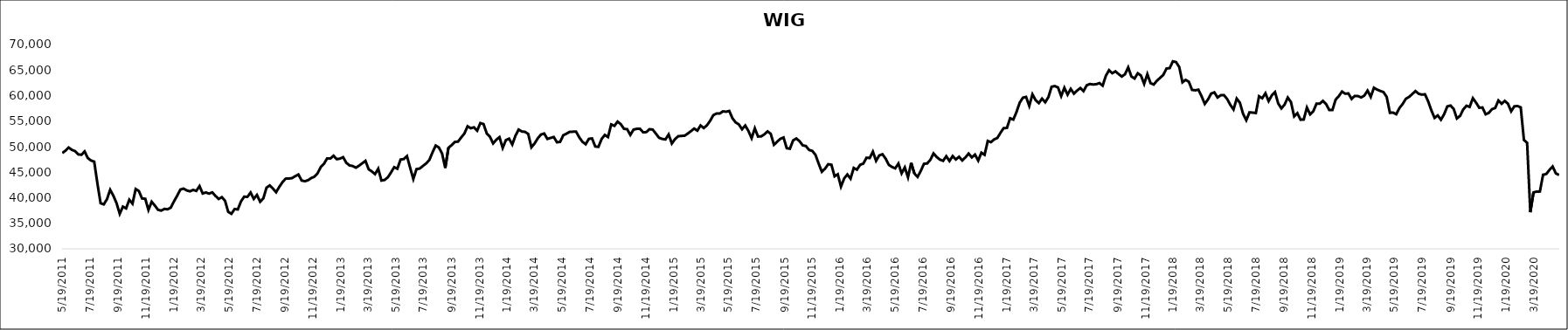
| Category | WIG |
|---|---|
| 5/19/11 | 48747.55 |
| 5/26/11 | 49215.53 |
| 6/2/11 | 49824.93 |
| 6/9/11 | 49378.82 |
| 6/16/11 | 49129.21 |
| 6/23/11 | 48485.26 |
| 6/30/11 | 48414.36 |
| 7/7/11 | 49057.05 |
| 7/14/11 | 47768.38 |
| 7/21/11 | 47291.31 |
| 7/28/11 | 47071.4 |
| 8/4/11 | 42828.22 |
| 8/11/11 | 38934.71 |
| 8/18/11 | 38697.56 |
| 8/25/11 | 39715.27 |
| 9/1/11 | 41553.09 |
| 9/8/11 | 40405.17 |
| 9/15/11 | 38945 |
| 9/22/11 | 36851.2 |
| 9/29/11 | 38264.32 |
| 10/6/11 | 37915.03 |
| 10/13/11 | 39608.13 |
| 10/20/11 | 38835.92 |
| 10/27/11 | 41708.88 |
| 11/3/11 | 41313.92 |
| 11/10/11 | 39853.18 |
| 11/17/11 | 39797.19 |
| 11/24/11 | 37607.27 |
| 12/1/11 | 39215.21 |
| 12/8/11 | 38474.28 |
| 12/15/11 | 37637.47 |
| 12/22/11 | 37478.7 |
| 12/29/11 | 37814.52 |
| 1/5/12 | 37739.39 |
| 1/12/12 | 38062.87 |
| 1/19/12 | 39288.13 |
| 1/26/12 | 40392.48 |
| 2/2/12 | 41602.24 |
| 2/9/12 | 41792.46 |
| 2/16/12 | 41430.3 |
| 2/23/12 | 41258.14 |
| 3/1/12 | 41533.87 |
| 3/8/12 | 41337.97 |
| 3/15/12 | 42281.33 |
| 3/22/12 | 40834.43 |
| 3/29/12 | 41028.06 |
| 4/5/12 | 40802.41 |
| 4/12/12 | 41053.82 |
| 4/19/12 | 40354.53 |
| 4/26/12 | 39761.78 |
| 5/3/12 | 40114.73 |
| 5/10/12 | 39404.16 |
| 5/17/12 | 37228.88 |
| 5/24/12 | 36852.75 |
| 5/31/12 | 37793.58 |
| 6/7/12 | 37707.25 |
| 6/14/12 | 39286.64 |
| 6/21/12 | 40207.61 |
| 6/28/12 | 40165.34 |
| 7/5/12 | 41013.96 |
| 7/12/12 | 39778.1 |
| 7/19/12 | 40545.64 |
| 7/26/12 | 39213.05 |
| 8/2/12 | 39876.95 |
| 8/9/12 | 41976.63 |
| 8/16/12 | 42408.41 |
| 8/23/12 | 41795.63 |
| 8/30/12 | 41077.44 |
| 9/6/12 | 42134.93 |
| 9/13/12 | 43047.41 |
| 9/20/12 | 43737.02 |
| 9/27/12 | 43763.3 |
| 10/4/12 | 43840.23 |
| 10/11/12 | 44224.67 |
| 10/18/12 | 44550.12 |
| 10/25/12 | 43374.6 |
| 11/1/12 | 43232.44 |
| 11/8/12 | 43429.42 |
| 11/15/12 | 43845.94 |
| 11/22/12 | 44121.53 |
| 11/29/12 | 44787.84 |
| 12/6/12 | 46019.97 |
| 12/13/12 | 46653.84 |
| 12/20/12 | 47701.82 |
| 12/27/12 | 47673.03 |
| 1/3/13 | 48222.72 |
| 1/10/13 | 47546.91 |
| 1/17/13 | 47661.37 |
| 1/24/13 | 47942.04 |
| 1/31/13 | 46840.15 |
| 2/7/13 | 46329.66 |
| 2/14/13 | 46211.54 |
| 2/21/13 | 45879.9 |
| 2/28/13 | 46280.36 |
| 3/7/13 | 46745.26 |
| 3/14/13 | 47223.68 |
| 3/21/13 | 45580.47 |
| 3/28/13 | 45147.57 |
| 4/4/13 | 44623.89 |
| 4/11/13 | 45688.48 |
| 4/18/13 | 43364.7 |
| 4/25/13 | 43482.18 |
| 5/2/13 | 43991.51 |
| 5/9/13 | 44943.16 |
| 5/16/13 | 45992.03 |
| 5/23/13 | 45687.76 |
| 5/30/13 | 47476.64 |
| 6/6/13 | 47573.66 |
| 6/13/13 | 48152.82 |
| 6/20/13 | 45870 |
| 6/27/13 | 43667.37 |
| 7/4/13 | 45613.75 |
| 7/11/13 | 45712.72 |
| 7/18/13 | 46221.23 |
| 7/25/13 | 46713.02 |
| 8/1/13 | 47370.81 |
| 8/8/13 | 48862.88 |
| 8/15/13 | 50223.95 |
| 8/22/13 | 49846.48 |
| 8/29/13 | 48676.45 |
| 9/5/13 | 45830.66 |
| 9/12/13 | 49771.55 |
| 9/19/13 | 50300.53 |
| 9/26/13 | 50936.34 |
| 10/3/13 | 50982.03 |
| 10/10/13 | 51806.83 |
| 10/17/13 | 52573.59 |
| 10/24/13 | 53994.46 |
| 10/31/13 | 53607.86 |
| 11/7/13 | 53785.07 |
| 11/14/13 | 53127.16 |
| 11/21/13 | 54621.21 |
| 11/28/13 | 54420.19 |
| 12/5/13 | 52597.13 |
| 12/12/13 | 51947.96 |
| 12/19/13 | 50631.75 |
| 12/26/13 | 51362.3 |
| 1/2/14 | 51865.89 |
| 1/9/14 | 49753.03 |
| 1/16/14 | 51288.7 |
| 1/23/14 | 51569.21 |
| 1/30/14 | 50417.17 |
| 2/6/14 | 52138.87 |
| 2/13/14 | 53349.65 |
| 2/20/14 | 52967.02 |
| 2/27/14 | 52906.04 |
| 3/6/14 | 52487.84 |
| 3/13/14 | 49878.65 |
| 3/20/14 | 50627.71 |
| 3/27/14 | 51642.99 |
| 4/3/14 | 52376.18 |
| 4/10/14 | 52580.73 |
| 4/17/14 | 51510.98 |
| 4/24/14 | 51705.76 |
| 5/1/14 | 51892.77 |
| 5/8/14 | 50851.25 |
| 5/15/14 | 50944.5 |
| 5/22/14 | 52244.13 |
| 5/29/14 | 52553.48 |
| 6/5/14 | 52901.29 |
| 6/12/14 | 52927.91 |
| 6/19/14 | 52937.45 |
| 6/26/14 | 51815.43 |
| 7/3/14 | 50951.73 |
| 7/10/14 | 50474.36 |
| 7/17/14 | 51527.37 |
| 7/24/14 | 51613.47 |
| 7/31/14 | 50037.12 |
| 8/7/14 | 49958.67 |
| 8/14/14 | 51512.57 |
| 8/21/14 | 52294.93 |
| 8/28/14 | 51882.01 |
| 9/4/14 | 54358.49 |
| 9/11/14 | 54065.27 |
| 9/18/14 | 54906.1 |
| 9/25/14 | 54411.77 |
| 10/2/14 | 53498.77 |
| 10/9/14 | 53416.03 |
| 10/16/14 | 52297.79 |
| 10/23/14 | 53335.43 |
| 10/30/14 | 53492 |
| 11/6/14 | 53512.14 |
| 11/13/14 | 52816.35 |
| 11/20/14 | 52848.54 |
| 11/27/14 | 53415.63 |
| 12/4/14 | 53346.86 |
| 12/11/14 | 52550.03 |
| 12/18/14 | 51739.04 |
| 12/25/14 | 51511.68 |
| 1/1/15 | 51416.08 |
| 1/8/15 | 52391 |
| 1/15/15 | 50616.63 |
| 1/22/15 | 51484.81 |
| 1/29/15 | 52040.24 |
| 2/5/15 | 52107.26 |
| 2/12/15 | 52139.81 |
| 2/19/15 | 52572.95 |
| 2/26/15 | 53042.6 |
| 3/5/15 | 53546.4 |
| 3/12/15 | 53136.13 |
| 3/19/15 | 54148.48 |
| 3/26/15 | 53649.9 |
| 4/2/15 | 54179.04 |
| 4/9/15 | 55063.85 |
| 4/16/15 | 56165.1 |
| 4/23/15 | 56492.95 |
| 4/30/15 | 56477.69 |
| 5/7/15 | 56911.34 |
| 5/14/15 | 56845.83 |
| 5/21/15 | 56990.6 |
| 5/28/15 | 55556.13 |
| 6/4/15 | 54749.74 |
| 6/11/15 | 54357.69 |
| 6/18/15 | 53408.53 |
| 6/25/15 | 54141.2 |
| 7/2/15 | 53074.71 |
| 7/9/15 | 51658.71 |
| 7/16/15 | 53588.24 |
| 7/23/15 | 51986.22 |
| 7/30/15 | 52011.81 |
| 8/6/15 | 52418.07 |
| 8/13/15 | 52995.96 |
| 8/20/15 | 52508.32 |
| 8/27/15 | 50366.09 |
| 9/3/15 | 50977.06 |
| 9/10/15 | 51527.08 |
| 9/17/15 | 51801.58 |
| 9/24/15 | 49701.31 |
| 10/1/15 | 49593.95 |
| 10/8/15 | 51222.77 |
| 10/15/15 | 51599.62 |
| 10/22/15 | 51094.29 |
| 10/29/15 | 50262.68 |
| 11/5/15 | 50125.85 |
| 11/12/15 | 49358.2 |
| 11/19/15 | 49177.74 |
| 11/26/15 | 48418.14 |
| 12/3/15 | 46693.09 |
| 12/10/15 | 45093.65 |
| 12/17/15 | 45684.05 |
| 12/24/15 | 46564.08 |
| 12/31/15 | 46467.38 |
| 1/7/16 | 44195.91 |
| 1/14/16 | 44596.08 |
| 1/21/16 | 42180.3 |
| 1/28/16 | 43778.96 |
| 2/4/16 | 44557.64 |
| 2/11/16 | 43741.96 |
| 2/18/16 | 45834.88 |
| 2/25/16 | 45497.77 |
| 3/3/16 | 46448.27 |
| 3/10/16 | 46686.74 |
| 3/17/16 | 47833.39 |
| 3/24/16 | 47778.01 |
| 3/31/16 | 49017.35 |
| 4/7/16 | 47231.36 |
| 4/14/16 | 48285.21 |
| 4/21/16 | 48514.39 |
| 4/28/16 | 47643.7 |
| 5/5/16 | 46430.16 |
| 5/12/16 | 46022.02 |
| 5/19/16 | 45751.68 |
| 5/26/16 | 46695.37 |
| 6/2/16 | 44772.72 |
| 6/9/16 | 45940.12 |
| 6/16/16 | 44007.81 |
| 6/23/16 | 46826.85 |
| 6/30/16 | 44748.53 |
| 7/7/16 | 44077.16 |
| 7/14/16 | 45246.26 |
| 7/21/16 | 46639.17 |
| 7/28/16 | 46718.98 |
| 8/4/16 | 47407.09 |
| 8/11/16 | 48675.96 |
| 8/18/16 | 47967.07 |
| 8/25/16 | 47464.07 |
| 9/1/16 | 47221.32 |
| 9/8/16 | 48129.15 |
| 9/15/16 | 47198.39 |
| 9/22/16 | 48154.88 |
| 9/29/16 | 47494.62 |
| 10/6/16 | 48014.44 |
| 10/13/16 | 47303.15 |
| 10/20/16 | 47894.17 |
| 10/27/16 | 48651.28 |
| 11/3/16 | 47899.61 |
| 11/10/16 | 48447.59 |
| 11/17/16 | 47274.21 |
| 11/24/16 | 48824.83 |
| 12/1/16 | 48404.21 |
| 12/8/16 | 51123.43 |
| 12/15/16 | 50881.35 |
| 12/22/16 | 51423.71 |
| 12/29/16 | 51703.91 |
| 1/5/17 | 52721.67 |
| 1/12/17 | 53650.94 |
| 1/19/17 | 53654.99 |
| 1/26/17 | 55560.23 |
| 2/2/17 | 55303.11 |
| 2/9/17 | 56785.52 |
| 2/16/17 | 58610.28 |
| 2/23/17 | 59583.89 |
| 3/2/17 | 59743.64 |
| 3/9/17 | 57986.6 |
| 3/16/17 | 60247.18 |
| 3/23/17 | 59093.68 |
| 3/30/17 | 58527.2 |
| 4/6/17 | 59406.36 |
| 4/13/17 | 58695.36 |
| 4/20/17 | 59700.07 |
| 4/27/17 | 61731.8 |
| 5/4/17 | 61862.8 |
| 5/11/17 | 61598.78 |
| 5/18/17 | 59901.12 |
| 5/25/17 | 61536.22 |
| 6/1/17 | 60181.96 |
| 6/8/17 | 61312.68 |
| 6/15/17 | 60381.07 |
| 6/22/17 | 60987.33 |
| 6/29/17 | 61475.96 |
| 7/6/17 | 60869.83 |
| 7/13/17 | 62018.68 |
| 7/20/17 | 62269.72 |
| 7/27/17 | 62171.7 |
| 8/3/17 | 62231.08 |
| 8/10/17 | 62451.57 |
| 8/17/17 | 61949.4 |
| 8/24/17 | 63886.54 |
| 8/31/17 | 64973.76 |
| 9/7/17 | 64381.87 |
| 9/14/17 | 64748.47 |
| 9/21/17 | 64209.19 |
| 9/28/17 | 63729.77 |
| 10/5/17 | 64185.71 |
| 10/12/17 | 65529.1 |
| 10/19/17 | 63745 |
| 10/26/17 | 63342.71 |
| 11/2/17 | 64375.83 |
| 11/9/17 | 63923.62 |
| 11/16/17 | 62299.29 |
| 11/23/17 | 64207.77 |
| 11/30/17 | 62440.31 |
| 12/7/17 | 62164.65 |
| 12/14/17 | 62916.39 |
| 12/21/17 | 63477.25 |
| 12/28/17 | 64053.47 |
| 1/4/18 | 65297.96 |
| 1/11/18 | 65379.88 |
| 1/18/18 | 66709.12 |
| 1/25/18 | 66561.79 |
| 2/1/18 | 65585.79 |
| 2/8/18 | 62604.89 |
| 2/15/18 | 63078.16 |
| 2/22/18 | 62717.27 |
| 3/1/18 | 61116.96 |
| 3/8/18 | 61036.99 |
| 3/15/18 | 61156.91 |
| 3/22/18 | 59862.55 |
| 3/29/18 | 58377.42 |
| 4/5/18 | 59244.04 |
| 4/12/18 | 60393.23 |
| 4/19/18 | 60629.81 |
| 4/26/18 | 59628.04 |
| 5/3/18 | 60066.46 |
| 5/10/18 | 60091.26 |
| 5/17/18 | 59337.27 |
| 5/24/18 | 58189.49 |
| 5/31/18 | 57282.73 |
| 6/7/18 | 59412.76 |
| 6/14/18 | 58603.93 |
| 6/21/18 | 56425.25 |
| 6/28/18 | 55169.77 |
| 7/5/18 | 56719.88 |
| 7/12/18 | 56671.44 |
| 7/19/18 | 56585.5 |
| 7/26/18 | 59871.2 |
| 8/2/18 | 59484.35 |
| 8/9/18 | 60455.75 |
| 8/16/18 | 58921.44 |
| 8/23/18 | 60044.45 |
| 8/30/18 | 60690.32 |
| 9/6/18 | 58469.6 |
| 9/13/18 | 57493.38 |
| 9/20/18 | 58231.57 |
| 9/27/18 | 59616.27 |
| 10/4/18 | 58736.08 |
| 10/11/18 | 55941.06 |
| 10/18/18 | 56560.93 |
| 10/25/18 | 55271.63 |
| 11/1/18 | 55312.71 |
| 11/8/18 | 57655.73 |
| 11/15/18 | 56329.01 |
| 11/22/18 | 56932.62 |
| 11/29/18 | 58412.94 |
| 12/6/18 | 58409.09 |
| 12/13/18 | 58952.55 |
| 12/20/18 | 58349.03 |
| 12/27/18 | 57183.28 |
| 1/3/19 | 57192.42 |
| 1/10/19 | 59219.23 |
| 1/17/19 | 59894.9 |
| 1/24/19 | 60791.02 |
| 1/31/19 | 60367.42 |
| 2/7/19 | 60422.38 |
| 2/14/19 | 59348.4 |
| 2/21/19 | 59938.07 |
| 2/28/19 | 59903.7 |
| 3/7/19 | 59638.3 |
| 3/14/19 | 60002.72 |
| 3/21/19 | 60976.51 |
| 3/28/19 | 59752.66 |
| 4/4/19 | 61533.27 |
| 4/11/19 | 61168.92 |
| 4/18/19 | 60910.11 |
| 4/25/19 | 60680.62 |
| 5/2/19 | 59744.3 |
| 5/9/19 | 56637.25 |
| 5/16/19 | 56664.5 |
| 5/23/19 | 56351.13 |
| 5/30/19 | 57566.83 |
| 6/6/19 | 58360.5 |
| 6/13/19 | 59374.38 |
| 6/20/19 | 59738.56 |
| 6/27/19 | 60293.37 |
| 7/4/19 | 60888.98 |
| 7/11/19 | 60362.11 |
| 7/18/19 | 60192.6 |
| 7/25/19 | 60249.72 |
| 8/1/19 | 58863.73 |
| 8/8/19 | 57102.69 |
| 8/15/19 | 55634.7 |
| 8/22/19 | 56118.92 |
| 8/29/19 | 55273.05 |
| 9/5/19 | 56358.3 |
| 9/12/19 | 57886.6 |
| 9/19/19 | 58053.03 |
| 9/26/19 | 57377.87 |
| 10/3/19 | 55523.06 |
| 10/10/19 | 56034.97 |
| 10/17/19 | 57297.12 |
| 10/24/19 | 58012.97 |
| 10/31/19 | 57783.02 |
| 11/7/19 | 59492.22 |
| 11/14/19 | 58622.1 |
| 11/21/19 | 57618.54 |
| 11/28/19 | 57669.94 |
| 12/5/19 | 56338.75 |
| 12/12/19 | 56621.06 |
| 12/19/19 | 57346.95 |
| 12/26/19 | 57569.71 |
| 1/2/20 | 59048.28 |
| 1/9/20 | 58397.17 |
| 1/16/20 | 58962.37 |
| 1/23/20 | 58401.85 |
| 1/30/20 | 56923.36 |
| 2/6/20 | 57900.04 |
| 2/13/20 | 57960.23 |
| 2/20/20 | 57693.12 |
| 2/27/20 | 51318.69 |
| 3/5/20 | 50753.91 |
| 3/12/20 | 37164.02 |
| 3/19/20 | 41041.92 |
| 3/26/20 | 41202.98 |
| 4/2/20 | 41219.51 |
| 4/9/20 | 44499.23 |
| 4/16/20 | 44645.12 |
| 4/23/20 | 45450.43 |
| 4/30/20 | 46117 |
| 5/7/20 | 44769.05 |
| 5/14/20 | 44450.71 |